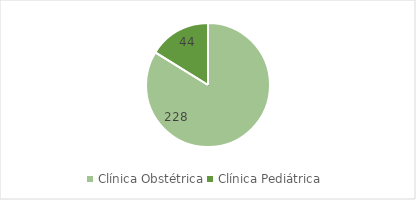
| Category | Series 0 |
|---|---|
| Clínica Obstétrica | 228 |
| Clínica Pediátrica  | 44 |